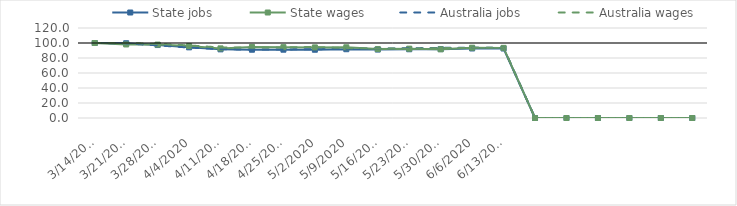
| Category | State jobs | State wages | Australia jobs | Australia wages |
|---|---|---|---|---|
| 14/03/2020 | 100 | 100 | 100 | 100 |
| 21/03/2020 | 99.682 | 98.049 | 99.495 | 100.113 |
| 28/03/2020 | 97.258 | 97.875 | 96.817 | 98.771 |
| 04/04/2020 | 94.208 | 95.956 | 93.908 | 96.774 |
| 11/04/2020 | 91.534 | 92.822 | 91.822 | 94.06 |
| 18/04/2020 | 91.037 | 94.758 | 91.153 | 93.831 |
| 25/04/2020 | 91.067 | 94.444 | 91.399 | 94.154 |
| 02/05/2020 | 91.016 | 94.141 | 91.732 | 94.697 |
| 09/05/2020 | 91.7 | 94.273 | 92.161 | 93.23 |
| 16/05/2020 | 91.241 | 91.895 | 92.673 | 92.722 |
| 23/05/2020 | 91.66 | 92.453 | 92.969 | 92.453 |
| 30/05/2020 | 91.82 | 91.614 | 93.509 | 93.187 |
| 06/06/2020 | 92.698 | 93.722 | 93.654 | 93.503 |
| 13/06/2020 | 92.665 | 93.5 | 93.635 | 93.681 |